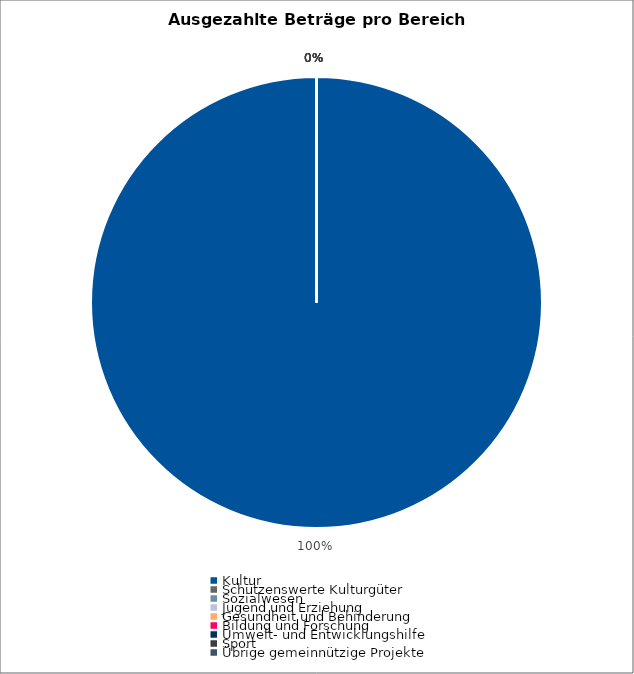
| Category | Series 0 |
|---|---|
| Kultur | 3950125 |
| Schützenswerte Kulturgüter | 0 |
| Sozialwesen | 0 |
| Jugend und Erziehung | 0 |
| Gesundheit und Behinderung | 0 |
| Bildung und Forschung | 0 |
| Umwelt- und Entwicklungshilfe | 0 |
| Sport | 0 |
| Übrige gemeinnützige Projekte | 0 |